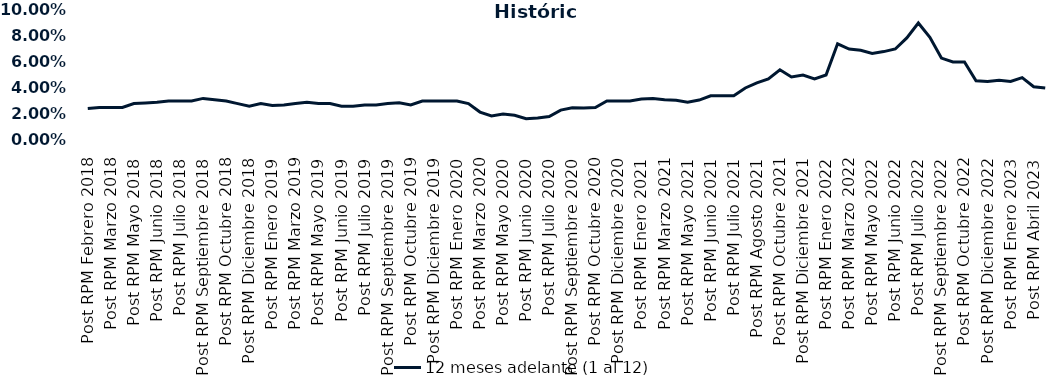
| Category | 12 meses adelante (1 al 12)  |
|---|---|
| Post RPM Febrero 2018 | 0.024 |
| Pre RPM Marzo 2018 | 0.025 |
| Post RPM Marzo 2018 | 0.025 |
| Pre RPM Mayo 2018 | 0.025 |
| Post RPM Mayo 2018 | 0.028 |
| Pre RPM Junio 2018 | 0.028 |
| Post RPM Junio 2018 | 0.029 |
| Pre RPM Julio 2018 | 0.03 |
| Post RPM Julio 2018 | 0.03 |
| Pre RPM Septiembre 2018 | 0.03 |
| Post RPM Septiembre 2018 | 0.032 |
| Pre RPM Octubre 2018 | 0.031 |
| Post RPM Octubre 2018 | 0.03 |
| Pre RPM Diciembre 2018 | 0.028 |
| Post RPM Diciembre 2018 | 0.026 |
| Pre RPM Enero 2019 | 0.028 |
| Post RPM Enero 2019 | 0.026 |
| Pre RPM Marzo 2019 | 0.027 |
| Post RPM Marzo 2019 | 0.028 |
| Pre RPM Mayo 2019 | 0.029 |
| Post RPM Mayo 2019 | 0.028 |
| Pre RPM Junio 2019 | 0.028 |
| Post RPM Junio 2019 | 0.026 |
| Pre RPM Julio 2019 | 0.026 |
| Post RPM Julio 2019 | 0.027 |
| Pre RPM Septiembre 2019 | 0.027 |
| Post RPM Septiembre 2019 | 0.028 |
| Pre RPM Octubre 2019 | 0.029 |
| Post RPM Octubre 2019 | 0.027 |
| Pre RPM Diciembre 2019 | 0.03 |
| Post RPM Diciembre 2019 | 0.03 |
| Pre RPM Enero 2020 | 0.03 |
| Post RPM Enero 2020 | 0.03 |
| Pre RPM Marzo 2020 | 0.028 |
| Post RPM Marzo 2020 | 0.022 |
| Pre RPM Mayo 2020 | 0.018 |
| Post RPM Mayo 2020 | 0.02 |
| Pre RPM Junio 2020 | 0.019 |
| Post RPM Junio 2020 | 0.016 |
| Pre RPM Julio 2020 | 0.017 |
| Post RPM Julio 2020 | 0.018 |
| Pre RPM Septiembre 2020 | 0.023 |
| Post RPM Septiembre 2020 | 0.025 |
| Pre RPM Octubre 2020 | 0.025 |
| Post RPM Octubre 2020 | 0.025 |
| Pre RPM Diciembre 2020 | 0.03 |
| Post RPM Diciembre 2020 | 0.03 |
| Pre RPM Enero 2021 | 0.03 |
| Post RPM Enero 2021 | 0.032 |
| Pre RPM Marzo 2021 | 0.032 |
| Post RPM Marzo 2021 | 0.031 |
| Pre RPM Mayo 2021 | 0.03 |
| Post RPM Mayo 2021 | 0.029 |
| Pre RPM Junio 2021 | 0.031 |
| Post RPM Junio 2021 | 0.034 |
| Pre RPM Julio 2021 | 0.034 |
| Post RPM Julio 2021 | 0.034 |
| Pre RPM Agosto 2021 | 0.04 |
| Post RPM Agosto 2021 | 0.044 |
| Pre RPM Octubre 2021 | 0.047 |
| Post RPM Octubre 2021 | 0.054 |
| Pre RPM Diciembre 2021 | 0.048 |
| Post RPM Diciembre 2021 | 0.05 |
| Pre RPM Enero 2022 | 0.047 |
| Post RPM Enero 2022 | 0.05 |
| Pre RPM Marzo 2022 | 0.074 |
| Post RPM Marzo 2022 | 0.07 |
| Pre RPM Mayo 2022 | 0.069 |
| Post RPM Mayo 2022 | 0.066 |
| Pre RPM Junio 2022 | 0.068 |
| Post RPM Junio 2022 | 0.07 |
| Pre RPM Julio 2022 | 0.078 |
| Post RPM Julio 2022 | 0.09 |
| Pre RPM Septiembre 2022 | 0.079 |
| Post RPM Septiembre 2022 | 0.063 |
| Pre RPM Octubre 2022 | 0.06 |
| Post RPM Octubre 2022 | 0.06 |
| Pre RPM Diciembre 2022 | 0.046 |
| Post RPM Diciembre 2022 | 0.045 |
| Pre RPM Enero 2023 | 0.046 |
| Post RPM Enero 2023 | 0.045 |
| Pre RPM Abril 2023 | 0.048 |
| Post RPM Abril 2023 | 0.041 |
| Pre RPM Mayo 2023 | 0.04 |